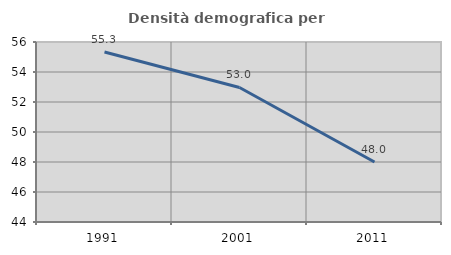
| Category | Densità demografica |
|---|---|
| 1991.0 | 55.332 |
| 2001.0 | 52.967 |
| 2011.0 | 48.002 |